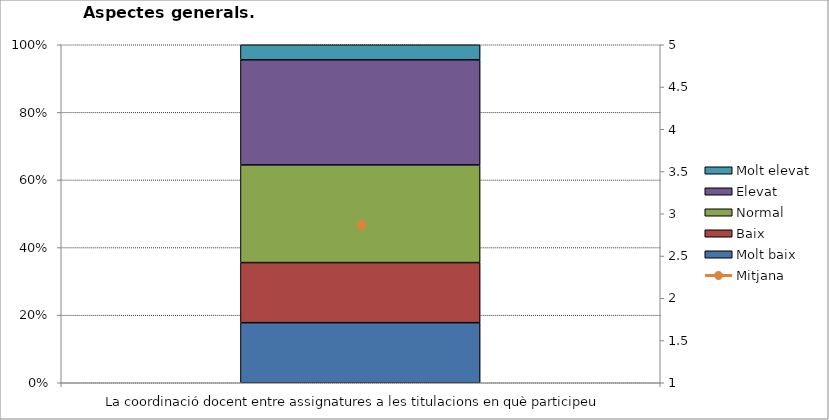
| Category | Molt baix | Baix | Normal  | Elevat | Molt elevat |
|---|---|---|---|---|---|
| La coordinació docent entre assignatures a les titulacions en què participeu | 8 | 8 | 13 | 14 | 2 |